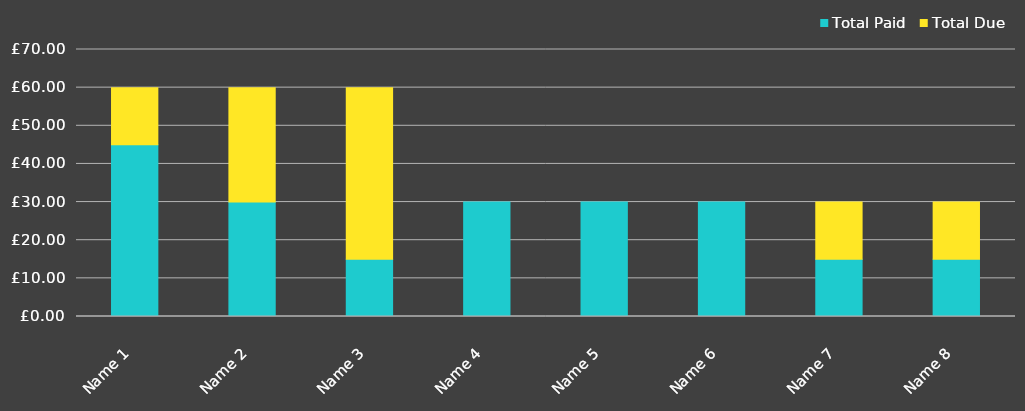
| Category | Total Paid | Total Due |
|---|---|---|
| Name 1 | 45 | 15 |
| Name 2 | 30 | 30 |
| Name 3 | 15 | 45 |
| Name 4 | 30 | 0 |
| Name 5 | 30 | 0 |
| Name 6 | 30 | 0 |
| Name 7 | 15 | 15 |
| Name 8 | 15 | 15 |